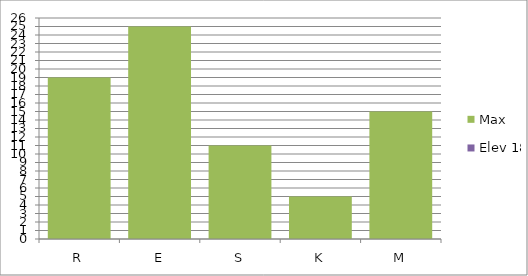
| Category | Max | Elev 18 |
|---|---|---|
| R | 19 | 0 |
| E | 25 | 0 |
| S | 11 | 0 |
| K | 5 | 0 |
| M | 15 | 0 |